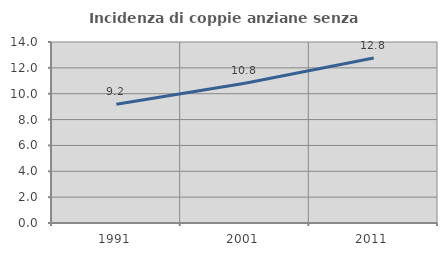
| Category | Incidenza di coppie anziane senza figli  |
|---|---|
| 1991.0 | 9.19 |
| 2001.0 | 10.814 |
| 2011.0 | 12.768 |